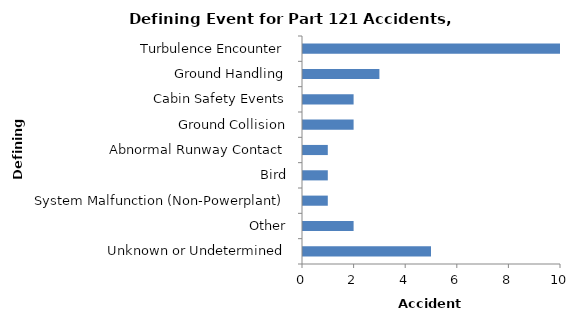
| Category | Accident Aircraft |
|---|---|
| Turbulence Encounter | 10 |
| Ground Handling | 3 |
| Cabin Safety Events | 2 |
| Ground Collision | 2 |
| Abnormal Runway Contact | 1 |
| Bird | 1 |
| System Malfunction (Non-Powerplant) | 1 |
| Other | 2 |
| Unknown or Undetermined | 5 |